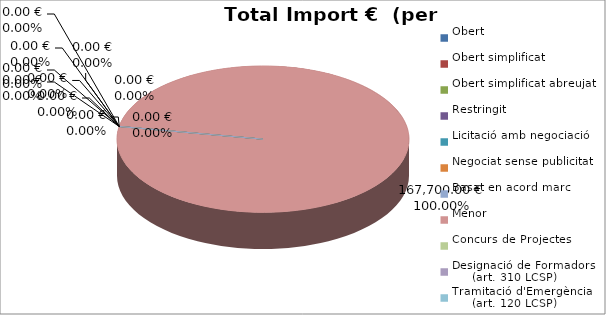
| Category | Total preu
(amb IVA) |
|---|---|
| Obert | 0 |
| Obert simplificat | 0 |
| Obert simplificat abreujat | 0 |
| Restringit | 0 |
| Licitació amb negociació | 0 |
| Negociat sense publicitat | 0 |
| Basat en acord marc | 0 |
| Menor | 167700 |
| Concurs de Projectes | 0 |
| Designació de Formadors
     (art. 310 LCSP) | 0 |
| Tramitació d'Emergència
     (art. 120 LCSP) | 0 |